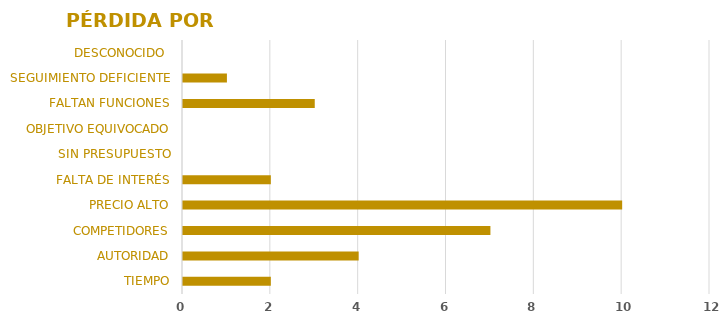
| Category | Series 0 |
|---|---|
| TIEMPO | 2 |
| AUTORIDAD | 4 |
| COMPETIDORES | 7 |
| PRECIO ALTO | 10 |
| FALTA DE INTERÉS | 2 |
| SIN PRESUPUESTO | 0 |
| OBJETIVO EQUIVOCADO | 0 |
| FALTAN FUNCIONES | 3 |
| SEGUIMIENTO DEFICIENTE | 1 |
| DESCONOCIDO  | 0 |